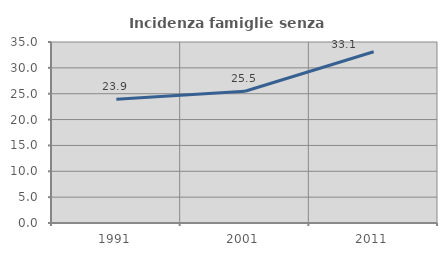
| Category | Incidenza famiglie senza nuclei |
|---|---|
| 1991.0 | 23.928 |
| 2001.0 | 25.479 |
| 2011.0 | 33.105 |